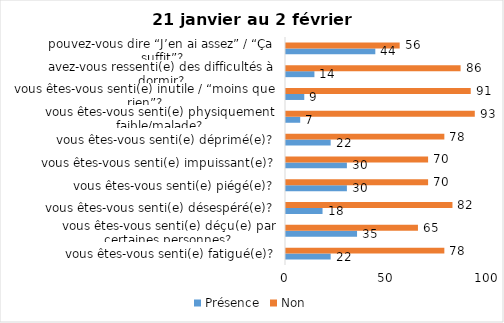
| Category | Présence | Non |
|---|---|---|
| vous êtes-vous senti(e) fatigué(e)? | 22 | 78 |
| vous êtes-vous senti(e) déçu(e) par certaines personnes? | 35 | 65 |
| vous êtes-vous senti(e) désespéré(e)? | 18 | 82 |
| vous êtes-vous senti(e) piégé(e)? | 30 | 70 |
| vous êtes-vous senti(e) impuissant(e)? | 30 | 70 |
| vous êtes-vous senti(e) déprimé(e)? | 22 | 78 |
| vous êtes-vous senti(e) physiquement faible/malade? | 7 | 93 |
| vous êtes-vous senti(e) inutile / “moins que rien”? | 9 | 91 |
| avez-vous ressenti(e) des difficultés à dormir? | 14 | 86 |
| pouvez-vous dire “J’en ai assez” / “Ça suffit”? | 44 | 56 |